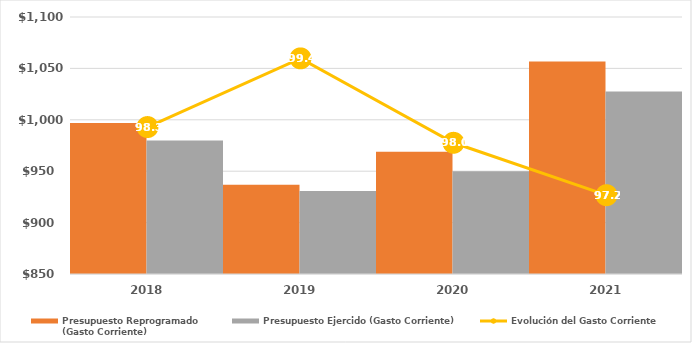
| Category | Presupuesto Reprogramado
(Gasto Corriente) | Presupuesto Ejercido (Gasto Corriente) |
|---|---|---|
| 2018.0 | 996966 | 979888 |
| 2019.0 | 936770.916 | 930739.308 |
| 2020.0 | 968900.978 | 949931.095 |
| 2021.0 | 1056806.473 | 1027496.009 |